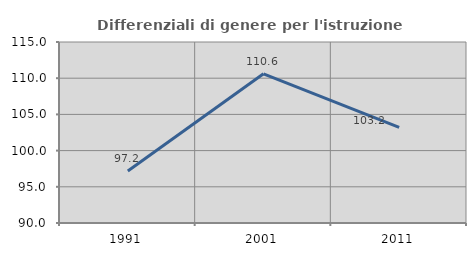
| Category | Differenziali di genere per l'istruzione superiore |
|---|---|
| 1991.0 | 97.192 |
| 2001.0 | 110.609 |
| 2011.0 | 103.208 |